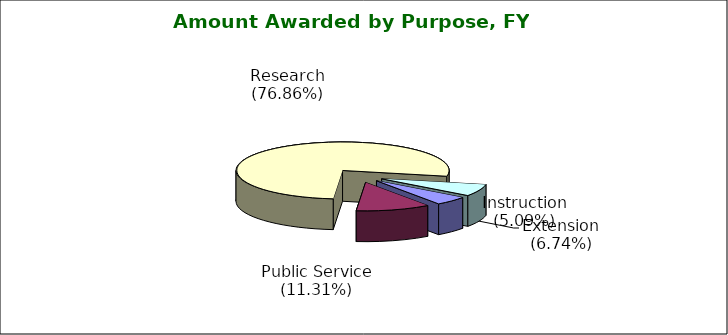
| Category | Series 0 |
|---|---|
| Instruction (5.09%) | 0.051 |
| Public Service (11.31%) | 0.113 |
| Research (76.86%) | 0.769 |
| Extension (6.74%) | 0.067 |